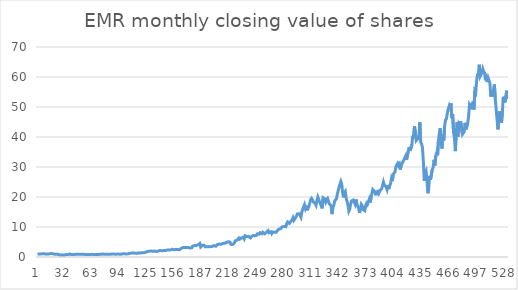
| Category | Series 0 |
|---|---|
| 0 | 0.975 |
| 1 | 1.022 |
| 2 | 1.03 |
| 3 | 1.031 |
| 4 | 1.034 |
| 5 | 1.026 |
| 6 | 1.052 |
| 7 | 1.069 |
| 8 | 1.064 |
| 9 | 1.007 |
| 10 | 0.948 |
| 11 | 1.002 |
| 12 | 1.005 |
| 13 | 1.044 |
| 14 | 1.069 |
| 15 | 1.098 |
| 16 | 1.168 |
| 17 | 1.046 |
| 18 | 1.017 |
| 19 | 1.02 |
| 20 | 0.912 |
| 21 | 0.98 |
| 22 | 0.968 |
| 23 | 0.931 |
| 24 | 0.813 |
| 25 | 0.74 |
| 26 | 0.608 |
| 27 | 0.542 |
| 28 | 0.723 |
| 29 | 0.632 |
| 30 | 0.585 |
| 31 | 0.704 |
| 32 | 0.801 |
| 33 | 0.75 |
| 34 | 0.816 |
| 35 | 0.956 |
| 36 | 0.965 |
| 37 | 0.893 |
| 38 | 0.849 |
| 39 | 0.822 |
| 40 | 0.84 |
| 41 | 0.927 |
| 42 | 0.838 |
| 43 | 0.939 |
| 44 | 0.932 |
| 45 | 0.922 |
| 46 | 0.956 |
| 47 | 0.933 |
| 48 | 0.927 |
| 49 | 0.918 |
| 50 | 0.892 |
| 51 | 0.904 |
| 52 | 0.889 |
| 53 | 0.901 |
| 54 | 0.861 |
| 55 | 0.786 |
| 56 | 0.852 |
| 57 | 0.852 |
| 58 | 0.827 |
| 59 | 0.808 |
| 60 | 0.871 |
| 61 | 0.868 |
| 62 | 0.877 |
| 63 | 0.874 |
| 64 | 0.858 |
| 65 | 0.898 |
| 66 | 0.866 |
| 67 | 0.83 |
| 68 | 0.786 |
| 69 | 0.829 |
| 70 | 0.89 |
| 71 | 0.954 |
| 72 | 0.914 |
| 73 | 0.977 |
| 74 | 0.991 |
| 75 | 0.912 |
| 76 | 0.895 |
| 77 | 0.904 |
| 78 | 0.951 |
| 79 | 0.961 |
| 80 | 0.887 |
| 81 | 0.904 |
| 82 | 0.914 |
| 83 | 0.941 |
| 84 | 0.982 |
| 85 | 0.937 |
| 86 | 0.995 |
| 87 | 0.971 |
| 88 | 0.909 |
| 89 | 0.902 |
| 90 | 0.975 |
| 91 | 0.962 |
| 92 | 0.959 |
| 93 | 0.892 |
| 94 | 0.909 |
| 95 | 0.999 |
| 96 | 1.042 |
| 97 | 1.138 |
| 98 | 1.092 |
| 99 | 1.066 |
| 100 | 0.991 |
| 101 | 1.13 |
| 102 | 1.065 |
| 103 | 1.086 |
| 104 | 1.158 |
| 105 | 1.288 |
| 106 | 1.328 |
| 107 | 1.412 |
| 108 | 1.371 |
| 109 | 1.293 |
| 110 | 1.275 |
| 111 | 1.256 |
| 112 | 1.204 |
| 113 | 1.328 |
| 114 | 1.385 |
| 115 | 1.32 |
| 116 | 1.316 |
| 117 | 1.37 |
| 118 | 1.451 |
| 119 | 1.393 |
| 120 | 1.393 |
| 121 | 1.358 |
| 122 | 1.602 |
| 123 | 1.563 |
| 124 | 1.838 |
| 125 | 1.867 |
| 126 | 1.922 |
| 127 | 1.918 |
| 128 | 1.998 |
| 129 | 1.894 |
| 130 | 1.87 |
| 131 | 1.911 |
| 132 | 1.996 |
| 133 | 1.867 |
| 134 | 1.814 |
| 135 | 2.002 |
| 136 | 1.941 |
| 137 | 2.238 |
| 138 | 2.189 |
| 139 | 2.189 |
| 140 | 2.085 |
| 141 | 2.073 |
| 142 | 2.135 |
| 143 | 1.991 |
| 144 | 2.133 |
| 145 | 2.121 |
| 146 | 2.308 |
| 147 | 2.295 |
| 148 | 2.359 |
| 149 | 2.313 |
| 150 | 2.372 |
| 151 | 2.598 |
| 152 | 2.607 |
| 153 | 2.418 |
| 154 | 2.371 |
| 155 | 2.467 |
| 156 | 2.55 |
| 157 | 2.602 |
| 158 | 2.503 |
| 159 | 2.42 |
| 160 | 2.402 |
| 161 | 2.699 |
| 162 | 2.876 |
| 163 | 2.867 |
| 164 | 3.15 |
| 165 | 3.27 |
| 166 | 3.177 |
| 167 | 3.163 |
| 168 | 3.131 |
| 169 | 2.884 |
| 170 | 3.188 |
| 171 | 2.921 |
| 172 | 3.007 |
| 173 | 3.216 |
| 174 | 3.065 |
| 175 | 3.65 |
| 176 | 3.838 |
| 177 | 3.806 |
| 178 | 3.801 |
| 179 | 3.795 |
| 180 | 3.998 |
| 181 | 4.086 |
| 182 | 4.402 |
| 183 | 4.504 |
| 184 | 3.337 |
| 185 | 3.309 |
| 186 | 3.884 |
| 187 | 3.772 |
| 188 | 3.886 |
| 189 | 3.434 |
| 190 | 3.448 |
| 191 | 3.391 |
| 192 | 3.69 |
| 193 | 3.462 |
| 194 | 3.306 |
| 195 | 3.45 |
| 196 | 3.522 |
| 197 | 3.498 |
| 198 | 3.527 |
| 199 | 3.802 |
| 200 | 3.5 |
| 201 | 3.603 |
| 202 | 3.764 |
| 203 | 4.178 |
| 204 | 4.001 |
| 205 | 4.326 |
| 206 | 4.404 |
| 207 | 4.255 |
| 208 | 4.181 |
| 209 | 4.518 |
| 210 | 4.683 |
| 211 | 4.593 |
| 212 | 4.691 |
| 213 | 4.828 |
| 214 | 4.661 |
| 215 | 5.079 |
| 216 | 5.003 |
| 217 | 4.957 |
| 218 | 4.216 |
| 219 | 3.97 |
| 220 | 4.167 |
| 221 | 4.396 |
| 222 | 4.724 |
| 223 | 5.397 |
| 224 | 5.485 |
| 225 | 5.596 |
| 226 | 5.548 |
| 227 | 6.32 |
| 228 | 5.923 |
| 229 | 5.955 |
| 230 | 6.348 |
| 231 | 6.22 |
| 232 | 6.62 |
| 233 | 6.072 |
| 234 | 7.087 |
| 235 | 6.894 |
| 236 | 6.808 |
| 237 | 6.857 |
| 238 | 6.825 |
| 239 | 6.627 |
| 240 | 6.366 |
| 241 | 6.725 |
| 242 | 6.559 |
| 243 | 7.168 |
| 244 | 6.855 |
| 245 | 7.103 |
| 246 | 7.285 |
| 247 | 7.218 |
| 248 | 7.746 |
| 249 | 7.746 |
| 250 | 7.613 |
| 251 | 8.096 |
| 252 | 7.811 |
| 253 | 7.777 |
| 254 | 8.262 |
| 255 | 7.941 |
| 256 | 7.739 |
| 257 | 7.673 |
| 258 | 8.183 |
| 259 | 8.318 |
| 260 | 8.796 |
| 261 | 8.113 |
| 262 | 7.959 |
| 263 | 8.389 |
| 264 | 7.822 |
| 265 | 8.355 |
| 266 | 8.599 |
| 267 | 8.253 |
| 268 | 8.409 |
| 269 | 8.222 |
| 270 | 8.693 |
| 271 | 8.78 |
| 272 | 9.276 |
| 273 | 9.329 |
| 274 | 9.434 |
| 275 | 9.704 |
| 276 | 10.092 |
| 277 | 9.986 |
| 278 | 10.143 |
| 279 | 10.161 |
| 280 | 10.125 |
| 281 | 11.175 |
| 282 | 11.694 |
| 283 | 11.98 |
| 284 | 11.207 |
| 285 | 11.621 |
| 286 | 12.034 |
| 287 | 12.394 |
| 288 | 13.082 |
| 289 | 12.213 |
| 290 | 12.192 |
| 291 | 13.12 |
| 292 | 12.957 |
| 293 | 14.363 |
| 294 | 14.18 |
| 295 | 14.418 |
| 296 | 14.566 |
| 297 | 13.242 |
| 298 | 14.934 |
| 299 | 15.971 |
| 300 | 16.285 |
| 301 | 17.449 |
| 302 | 16.249 |
| 303 | 17.122 |
| 304 | 15.581 |
| 305 | 16.436 |
| 306 | 16.866 |
| 307 | 18.08 |
| 308 | 19.159 |
| 309 | 19.572 |
| 310 | 19.121 |
| 311 | 18.324 |
| 312 | 18.211 |
| 313 | 17.928 |
| 314 | 17.275 |
| 315 | 18.866 |
| 316 | 20.002 |
| 317 | 19.799 |
| 318 | 18.429 |
| 319 | 17.724 |
| 320 | 17.596 |
| 321 | 16.218 |
| 322 | 19.76 |
| 323 | 19.659 |
| 324 | 19.37 |
| 325 | 18.37 |
| 326 | 19.162 |
| 327 | 19.549 |
| 328 | 18.582 |
| 329 | 17.744 |
| 330 | 17.861 |
| 331 | 17.141 |
| 332 | 14.29 |
| 333 | 16.662 |
| 334 | 17.211 |
| 335 | 18.624 |
| 336 | 19.058 |
| 337 | 19.414 |
| 338 | 21.01 |
| 339 | 21.263 |
| 340 | 23.306 |
| 341 | 23.25 |
| 342 | 25.144 |
| 343 | 24.247 |
| 344 | 21.461 |
| 345 | 19.889 |
| 346 | 21.38 |
| 347 | 21.848 |
| 348 | 19.521 |
| 349 | 18.508 |
| 350 | 17.414 |
| 351 | 15.289 |
| 352 | 15.926 |
| 353 | 17.692 |
| 354 | 18.687 |
| 355 | 18.962 |
| 356 | 18.975 |
| 357 | 18.909 |
| 358 | 17.591 |
| 359 | 19.186 |
| 360 | 17.746 |
| 361 | 16.897 |
| 362 | 16.313 |
| 363 | 14.694 |
| 364 | 16.112 |
| 365 | 17.578 |
| 366 | 17.14 |
| 367 | 15.818 |
| 368 | 16.003 |
| 369 | 15.418 |
| 370 | 17.237 |
| 371 | 17.923 |
| 372 | 17.512 |
| 373 | 18.403 |
| 374 | 19.253 |
| 375 | 18.179 |
| 376 | 19.595 |
| 377 | 21.218 |
| 378 | 22.508 |
| 379 | 22.212 |
| 380 | 21.855 |
| 381 | 20.959 |
| 382 | 21.064 |
| 383 | 21.027 |
| 384 | 22.383 |
| 385 | 21.379 |
| 386 | 22.069 |
| 387 | 21.942 |
| 388 | 22.708 |
| 389 | 23.835 |
| 390 | 25.005 |
| 391 | 23.985 |
| 392 | 23.801 |
| 393 | 23.302 |
| 394 | 22.491 |
| 395 | 24.004 |
| 396 | 22.618 |
| 397 | 23.762 |
| 398 | 24.445 |
| 399 | 26.087 |
| 400 | 25.27 |
| 401 | 27.645 |
| 402 | 27.312 |
| 403 | 28.317 |
| 404 | 30.07 |
| 405 | 30.739 |
| 406 | 31.224 |
| 407 | 30.486 |
| 408 | 30.963 |
| 409 | 29.156 |
| 410 | 30.521 |
| 411 | 31.156 |
| 412 | 31.357 |
| 413 | 32.405 |
| 414 | 32.958 |
| 415 | 33.616 |
| 416 | 32.372 |
| 417 | 32.402 |
| 418 | 35.334 |
| 419 | 36.639 |
| 420 | 35.391 |
| 421 | 35.595 |
| 422 | 37.438 |
| 423 | 40.472 |
| 424 | 39.75 |
| 425 | 43.597 |
| 426 | 43.322 |
| 427 | 38.826 |
| 428 | 39.192 |
| 429 | 39.577 |
| 430 | 40.192 |
| 431 | 44.984 |
| 432 | 38.234 |
| 433 | 37.655 |
| 434 | 36.408 |
| 435 | 31.732 |
| 436 | 25.462 |
| 437 | 28.213 |
| 438 | 28.779 |
| 439 | 25.706 |
| 440 | 21.242 |
| 441 | 22.695 |
| 442 | 27.031 |
| 443 | 25.722 |
| 444 | 25.971 |
| 445 | 29.161 |
| 446 | 29.827 |
| 447 | 32.424 |
| 448 | 30.539 |
| 449 | 33.77 |
| 450 | 34.741 |
| 451 | 33.876 |
| 452 | 38.891 |
| 453 | 41.355 |
| 454 | 42.908 |
| 455 | 38.409 |
| 456 | 36.135 |
| 457 | 40.973 |
| 458 | 38.839 |
| 459 | 43.843 |
| 460 | 45.708 |
| 461 | 46.129 |
| 462 | 47.888 |
| 463 | 49.321 |
| 464 | 50.257 |
| 465 | 49.221 |
| 466 | 51.192 |
| 467 | 46.24 |
| 468 | 47.681 |
| 469 | 41.612 |
| 470 | 39.766 |
| 471 | 35.289 |
| 472 | 41.107 |
| 473 | 44.988 |
| 474 | 40.115 |
| 475 | 44.239 |
| 476 | 43.656 |
| 477 | 45.279 |
| 478 | 45.591 |
| 479 | 40.917 |
| 480 | 40.751 |
| 481 | 41.792 |
| 482 | 44.718 |
| 483 | 42.558 |
| 484 | 42.699 |
| 485 | 44.653 |
| 486 | 47.08 |
| 487 | 50.894 |
| 488 | 50.763 |
| 489 | 50.02 |
| 490 | 49.698 |
| 491 | 51.804 |
| 492 | 49.171 |
| 493 | 55.329 |
| 494 | 54.787 |
| 495 | 58.717 |
| 496 | 60.777 |
| 497 | 61.192 |
| 498 | 64.106 |
| 499 | 60.233 |
| 500 | 60.009 |
| 501 | 61.425 |
| 502 | 62.694 |
| 503 | 61.749 |
| 504 | 61.407 |
| 505 | 58.899 |
| 506 | 59.651 |
| 507 | 58.309 |
| 508 | 59.688 |
| 509 | 59.835 |
| 510 | 57.939 |
| 511 | 53.443 |
| 512 | 54.807 |
| 513 | 53.577 |
| 514 | 55.668 |
| 515 | 57.518 |
| 516 | 52.864 |
| 517 | 49.354 |
| 518 | 45.952 |
| 519 | 42.533 |
| 520 | 45.48 |
| 521 | 48.625 |
| 522 | 46.515 |
| 523 | 44.716 |
| 524 | 47.973 |
| 525 | 53.426 |
| 526 | 53.672 |
| 527 | 51.565 |
| 528 | 51.704 |
| 529 | 55.411 |
| 530 | 52.68 |
| 531 | 52.79 |